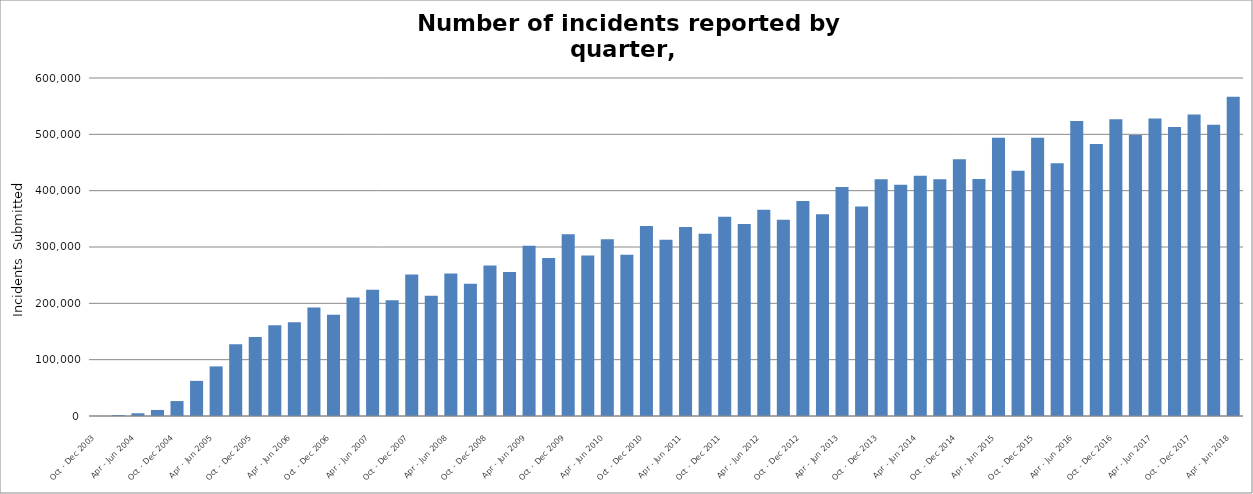
| Category | Series 0 |
|---|---|
| Oct - Dec 2003 | 158 |
| Jan - Mar 2004 | 1716 |
| Apr - Jun 2004 | 4823 |
| Jul - Sep 2004 | 10720 |
| Oct - Dec 2004 | 26508 |
| Jan - Mar 2005 | 62351 |
| Apr - Jun 2005 | 88042 |
| Jul - Sep 2005 | 127170 |
| Oct - Dec 2005 | 140394 |
| Jan - Mar 2006 | 161141 |
| Apr - Jun 2006 | 166539 |
| Jul - Sep 2006 | 192794 |
| Oct - Dec 2006 | 179538 |
| Jan - Mar 2007 | 210178 |
| Apr - Jun 2007 | 224047 |
| Jul - Sep 2007 | 205357 |
| Oct - Dec 2007 | 251010 |
| Jan - Mar 2008 | 213281 |
| Apr - Jun 2008 | 253006 |
| Jul - Sep 2008 | 234863 |
| Oct - Dec 2008 | 267135 |
| Jan - Mar 2009 | 255837 |
| Apr - Jun 2009 | 302198 |
| Jul - Sep 2009 | 280454 |
| Oct - Dec 2009 | 322757 |
| Jan - Mar 2010 | 284962 |
| Apr - Jun 2010 | 313827 |
| Jul - Sep 2010 | 286096 |
| Oct - Dec 2010 | 337149 |
| Jan - Mar 2011 | 312982 |
| Apr - Jun 2011 | 335327 |
| Jul - Sep 2011 | 323427 |
| Oct - Dec 2011 | 353578 |
| Jan - Mar 2012 | 340826 |
| Apr - Jun 2012 | 366262 |
| Jul - Sep 2012 | 348341 |
| Oct - Dec 2012 | 381754 |
| Jan - Mar 2013 | 358099 |
| Apr - Jun 2013 | 406617 |
| Jul - Sep 2013 | 372099 |
| Oct - Dec 2013 | 420286 |
| Jan - Mar 2014 | 410408 |
| Apr - Jun 2014 | 426315 |
| Jul - Sep 2014 | 420333 |
| Oct - Dec 2014 | 455584 |
| Jan - Mar 2015 | 420510 |
| Apr - Jun 2015 | 493795 |
| Jul - Sep 2015 | 435245 |
| Oct - Dec 2015 | 494082 |
| Jan - Mar 2016 | 448659 |
| Apr - Jun 2016 | 523610 |
| Jul - Sep 2016 | 482727 |
| Oct - Dec 2016 | 526580 |
| Jan - Mar 2017 | 499023 |
| Apr - Jun 2017 | 528164 |
| Jul - Sep 2017 | 513153 |
| Oct - Dec 2017 | 535229 |
| Jan - Mar 2018 | 516918 |
| Apr - Jun 2018 | 566898 |